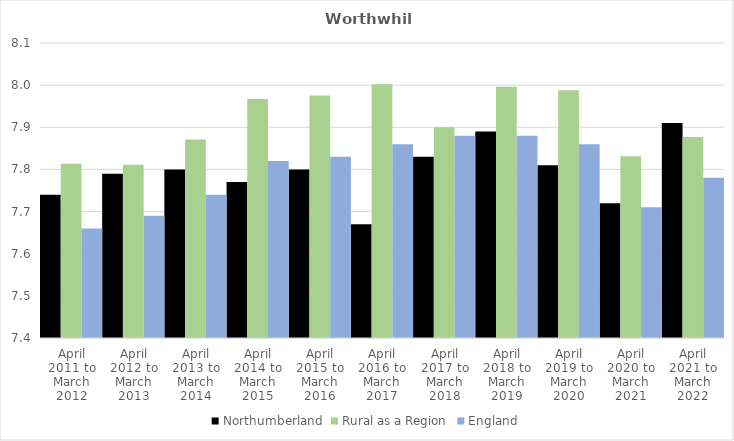
| Category | Northumberland | Rural as a Region | England |
|---|---|---|---|
| April 2011 to March 2012 | 7.74 | 7.813 | 7.66 |
| April 2012 to March 2013 | 7.79 | 7.811 | 7.69 |
| April 2013 to March 2014 | 7.8 | 7.871 | 7.74 |
| April 2014 to March 2015 | 7.77 | 7.967 | 7.82 |
| April 2015 to March 2016 | 7.8 | 7.975 | 7.83 |
| April 2016 to March 2017 | 7.67 | 8.002 | 7.86 |
| April 2017 to March 2018 | 7.83 | 7.9 | 7.88 |
| April 2018 to March 2019 | 7.89 | 7.996 | 7.88 |
| April 2019 to March 2020 | 7.81 | 7.988 | 7.86 |
| April 2020 to March 2021 | 7.72 | 7.831 | 7.71 |
| April 2021 to March 2022 | 7.91 | 7.877 | 7.78 |